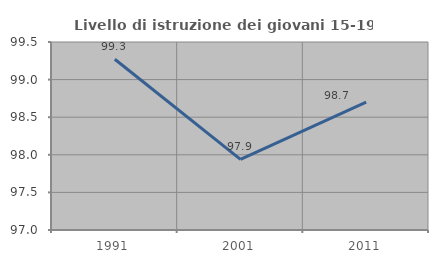
| Category | Livello di istruzione dei giovani 15-19 anni |
|---|---|
| 1991.0 | 99.27 |
| 2001.0 | 97.938 |
| 2011.0 | 98.701 |